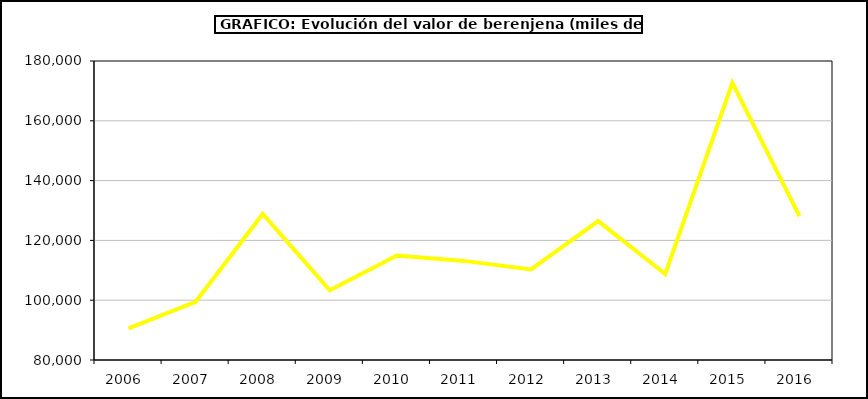
| Category | Valor |
|---|---|
| 2006.0 | 90580.747 |
| 2007.0 | 99479.743 |
| 2008.0 | 128841.418 |
| 2009.0 | 103302.87 |
| 2010.0 | 114934.838 |
| 2011.0 | 113149.264 |
| 2012.0 | 110271.616 |
| 2013.0 | 126461.496 |
| 2014.0 | 108753.977 |
| 2015.0 | 172694 |
| 2016.0 | 128140 |